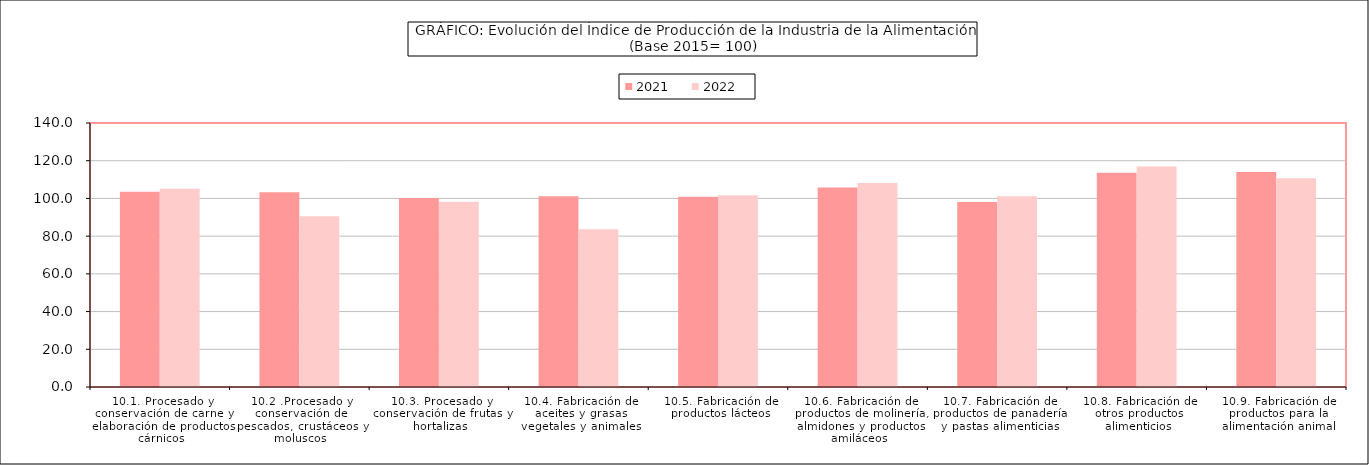
| Category | 2021 | 2022 |
|---|---|---|
| 10.1. Procesado y conservación de carne y elaboración de productos cárnicos | 103.606 | 105.116 |
| 10.2 .Procesado y conservación de pescados, crustáceos y moluscos | 103.339 | 90.539 |
| 10.3. Procesado y conservación de frutas y hortalizas | 100.259 | 98.228 |
| 10.4. Fabricación de aceites y grasas vegetales y animales | 101.152 | 83.59 |
| 10.5. Fabricación de productos lácteos | 100.83 | 101.655 |
| 10.6. Fabricación de productos de molinería, almidones y productos amiláceos | 105.743 | 108.238 |
| 10.7. Fabricación de productos de panadería y pastas alimenticias | 98.116 | 101.173 |
| 10.8. Fabricación de otros productos alimenticios | 113.668 | 116.907 |
| 10.9. Fabricación de productos para la alimentación animal | 114.035 | 110.698 |